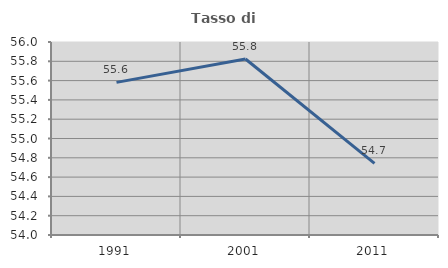
| Category | Tasso di occupazione   |
|---|---|
| 1991.0 | 55.581 |
| 2001.0 | 55.824 |
| 2011.0 | 54.743 |